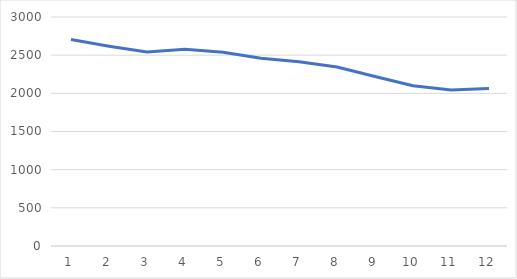
| Category | Series 0 |
|---|---|
| 0 | 2704 |
| 1 | 2618 |
| 2 | 2542 |
| 3 | 2579 |
| 4 | 2538 |
| 5 | 2459 |
| 6 | 2413 |
| 7 | 2345 |
| 8 | 2220 |
| 9 | 2100 |
| 10 | 2045 |
| 11 | 2062 |